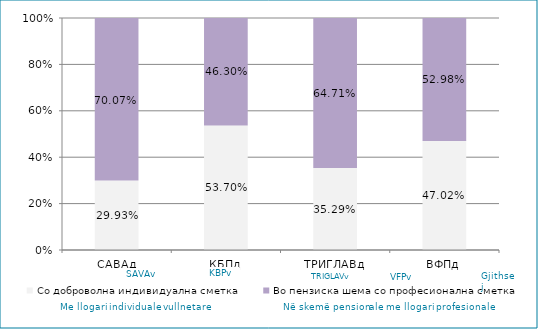
| Category | Со доброволна индивидуална сметка  | Во пензиска шема со професионална сметка |
|---|---|---|
| САВАд | 0.299 | 0.701 |
| КБПд | 0.537 | 0.463 |
| ТРИГЛАВд | 0.353 | 0.647 |
| ВФПд | 0.47 | 0.53 |